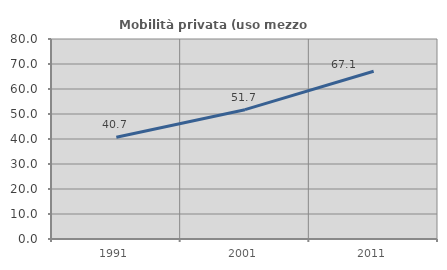
| Category | Mobilità privata (uso mezzo privato) |
|---|---|
| 1991.0 | 40.716 |
| 2001.0 | 51.733 |
| 2011.0 | 67.089 |